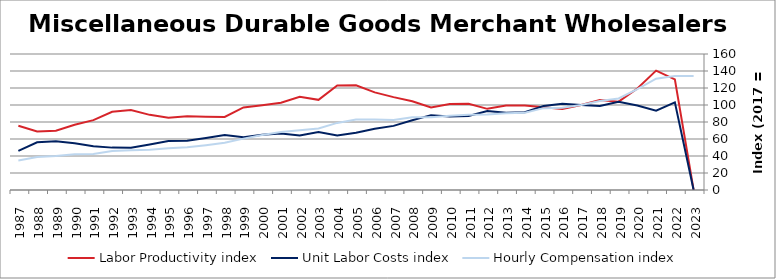
| Category | Labor Productivity index | Unit Labor Costs index | Hourly Compensation index |
|---|---|---|---|
| 2023.0 | 0 | 0 | 134.245 |
| 2022.0 | 130.144 | 103.135 | 134.224 |
| 2021.0 | 140.454 | 93.21 | 130.918 |
| 2020.0 | 119.419 | 99.405 | 118.709 |
| 2019.0 | 103.9 | 103.688 | 107.732 |
| 2018.0 | 105.901 | 98.767 | 104.595 |
| 2017.0 | 100 | 100 | 100 |
| 2016.0 | 95.335 | 101.416 | 96.685 |
| 2015.0 | 97.486 | 98.779 | 96.296 |
| 2014.0 | 99.305 | 91.466 | 90.83 |
| 2013.0 | 99.539 | 90.777 | 90.358 |
| 2012.0 | 95.479 | 92.929 | 88.728 |
| 2011.0 | 101.55 | 87.154 | 88.505 |
| 2010.0 | 101.188 | 86.377 | 87.404 |
| 2009.0 | 97.219 | 88.05 | 85.601 |
| 2008.0 | 104.361 | 82.049 | 85.628 |
| 2007.0 | 109.282 | 75.443 | 82.445 |
| 2006.0 | 114.832 | 72.134 | 82.833 |
| 2005.0 | 123.114 | 67.257 | 82.803 |
| 2004.0 | 123.009 | 64.172 | 78.937 |
| 2003.0 | 106.078 | 68.256 | 72.405 |
| 2002.0 | 109.583 | 64.27 | 70.43 |
| 2001.0 | 102.573 | 66.475 | 68.185 |
| 2000.0 | 99.714 | 64.914 | 64.728 |
| 1999.0 | 97.195 | 62.191 | 60.447 |
| 1998.0 | 85.904 | 64.68 | 55.563 |
| 1997.0 | 86.199 | 61.232 | 52.782 |
| 1996.0 | 86.8 | 57.871 | 50.232 |
| 1995.0 | 85.054 | 57.769 | 49.134 |
| 1994.0 | 88.411 | 53.587 | 47.376 |
| 1993.0 | 94.056 | 49.711 | 46.756 |
| 1992.0 | 92.07 | 49.853 | 45.899 |
| 1991.0 | 82.154 | 51.568 | 42.365 |
| 1990.0 | 76.699 | 54.97 | 42.162 |
| 1989.0 | 69.621 | 57.447 | 39.995 |
| 1988.0 | 68.96 | 56.097 | 38.685 |
| 1987.0 | 75.654 | 45.994 | 34.796 |